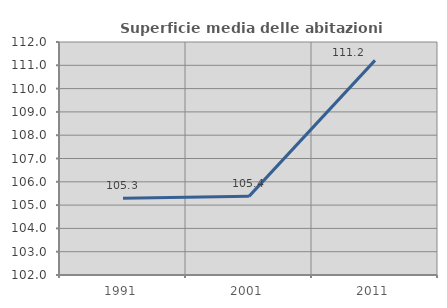
| Category | Superficie media delle abitazioni occupate |
|---|---|
| 1991.0 | 105.291 |
| 2001.0 | 105.374 |
| 2011.0 | 111.211 |